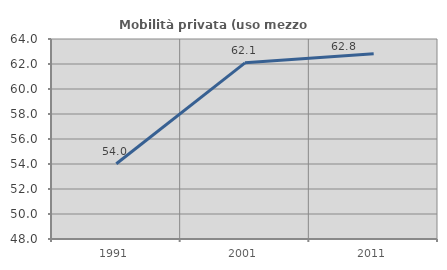
| Category | Mobilità privata (uso mezzo privato) |
|---|---|
| 1991.0 | 54.022 |
| 2001.0 | 62.095 |
| 2011.0 | 62.825 |